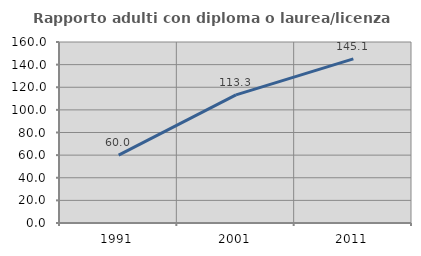
| Category | Rapporto adulti con diploma o laurea/licenza media  |
|---|---|
| 1991.0 | 60 |
| 2001.0 | 113.291 |
| 2011.0 | 145.11 |